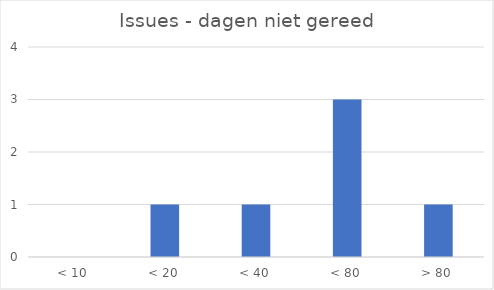
| Category | Series 0 |
|---|---|
| < 10 | 0 |
| < 20 | 1 |
| < 40 | 1 |
| < 80 | 3 |
| > 80 | 1 |